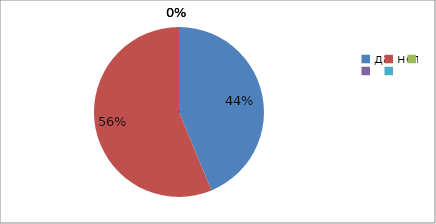
| Category | Series 0 | Series 1 |
|---|---|---|
| да | 43.8 | 43.8 |
| нет | 56.3 | 56.3 |